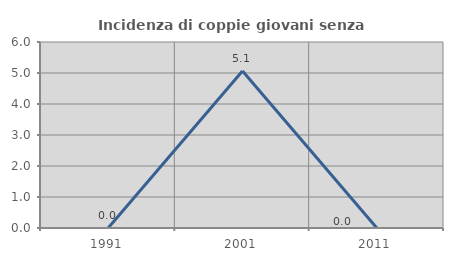
| Category | Incidenza di coppie giovani senza figli |
|---|---|
| 1991.0 | 0 |
| 2001.0 | 5.063 |
| 2011.0 | 0 |